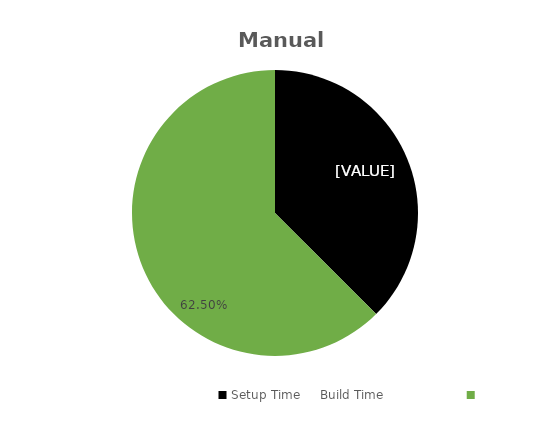
| Category | Series 0 |
|---|---|
| 0 | 0.375 |
| 1 | 0.625 |